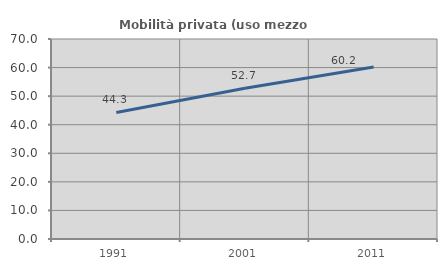
| Category | Mobilità privata (uso mezzo privato) |
|---|---|
| 1991.0 | 44.3 |
| 2001.0 | 52.738 |
| 2011.0 | 60.172 |